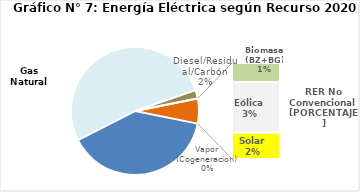
| Category | Series 0 |
|---|---|
| Agua | 1859.327 |
| Gas Natural | 2469.087 |
| Diesel/Residual/Carbón | 100.224 |
| Vapor (Cogeneracion) | 0.301 |
| Biomasa (BZ+BG) | 60.133 |
| Eólica | 156.77 |
| Solar | 81.518 |